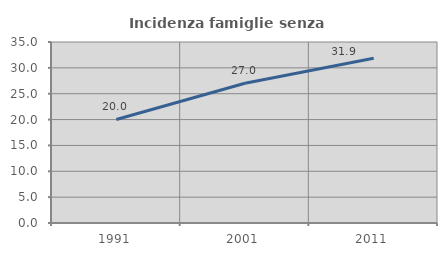
| Category | Incidenza famiglie senza nuclei |
|---|---|
| 1991.0 | 20.017 |
| 2001.0 | 27.03 |
| 2011.0 | 31.855 |